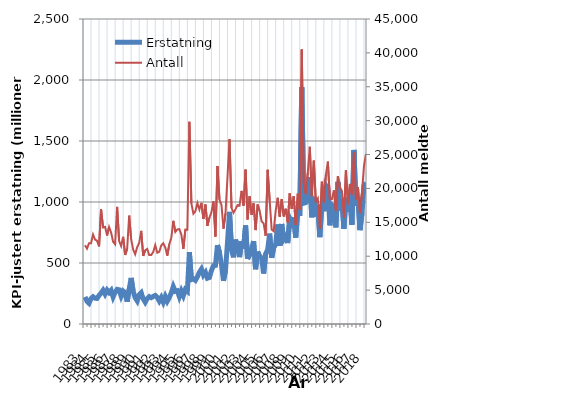
| Category | Erstatning |
|---|---|
| 1983.0 | 221.949 |
| nan | 185.917 |
| nan | 170.02 |
| nan | 208.268 |
| 1984.0 | 223.332 |
| nan | 211.256 |
| nan | 209.456 |
| nan | 234.278 |
| 1985.0 | 253.168 |
| nan | 276.72 |
| nan | 245.206 |
| nan | 278.097 |
| 1986.0 | 257.839 |
| nan | 275.898 |
| nan | 222.061 |
| nan | 259.862 |
| 1987.0 | 283.894 |
| nan | 280.151 |
| nan | 229.26 |
| nan | 269.731 |
| 1988.0 | 256.73 |
| nan | 183.009 |
| nan | 285.041 |
| nan | 377.599 |
| 1989.0 | 266.765 |
| nan | 215.61 |
| nan | 189.719 |
| nan | 239.351 |
| 1990.0 | 256.282 |
| nan | 206.18 |
| nan | 178.813 |
| nan | 208.132 |
| 1991.0 | 224.594 |
| nan | 215.946 |
| nan | 226.002 |
| nan | 233.658 |
| 1992.0 | 218.279 |
| nan | 188.082 |
| nan | 217.323 |
| nan | 179.335 |
| 1993.0 | 225.016 |
| nan | 187.263 |
| nan | 216.35 |
| nan | 255.948 |
| 1994.0 | 306.554 |
| nan | 267.998 |
| nan | 272.283 |
| nan | 224.429 |
| 1995.0 | 270.389 |
| nan | 232.615 |
| nan | 282.652 |
| nan | 268.364 |
| 1996.0 | 588.52 |
| nan | 364.421 |
| nan | 370.932 |
| nan | 357.735 |
| 1997.0 | 387.279 |
| nan | 424.973 |
| nan | 450.052 |
| nan | 401.55 |
| 1998.0 | 423.625 |
| nan | 375.292 |
| nan | 381.423 |
| nan | 438.403 |
| 1999.0 | 478.172 |
| nan | 480.494 |
| nan | 646.566 |
| nan | 585.551 |
| 2000.0 | 488.096 |
| nan | 354.465 |
| nan | 439.436 |
| nan | 670.004 |
| 2001.0 | 919.504 |
| nan | 608.715 |
| nan | 546.707 |
| nan | 691.697 |
| 2002.0 | 629.967 |
| nan | 548.133 |
| nan | 677.398 |
| nan | 617.261 |
| 2003.0 | 807.292 |
| nan | 533.752 |
| nan | 567.845 |
| nan | 618.583 |
| 2004.0 | 678.619 |
| nan | 448.657 |
| nan | 593.143 |
| nan | 554.406 |
| 2005.0 | 542.628 |
| nan | 414.1 |
| nan | 574.883 |
| nan | 609.232 |
| 2006.0 | 740.532 |
| nan | 543.078 |
| nan | 624.878 |
| nan | 651.921 |
| 2007.0 | 816.008 |
| nan | 641.555 |
| nan | 819.694 |
| nan | 693.036 |
| 2008.0 | 716.689 |
| nan | 663.474 |
| nan | 866.535 |
| nan | 832.218 |
| 2009.0 | 873.32 |
| nan | 708.997 |
| nan | 936.566 |
| nan | 885.25 |
| 2010.0 | 1941.881 |
| nan | 990.456 |
| nan | 995.22 |
| nan | 1018.153 |
| 2011.0 | 1203.27 |
| nan | 874.99 |
| nan | 1043.291 |
| nan | 879.248 |
| 2012.0 | 974.087 |
| nan | 712.146 |
| nan | 981.851 |
| nan | 924.505 |
| 2013.0 | 1135.389 |
| nan | 1111.761 |
| nan | 808.968 |
| nan | 977.139 |
| 2014.0 | 963.722 |
| nan | 791.406 |
| nan | 1164.2 |
| nan | 930.848 |
| 2015.0 | 1021.261 |
| nan | 782.106 |
| nan | 1035.286 |
| nan | 919.216 |
| 2016.0 | 1056.711 |
| nan | 813.389 |
| nan | 1426.54 |
| nan | 967.908 |
| 2017.0 | 1037.584 |
| nan | 769.551 |
| nan | 908.847 |
| nan | 1135.105 |
| 2018.0 | 1158.517 |